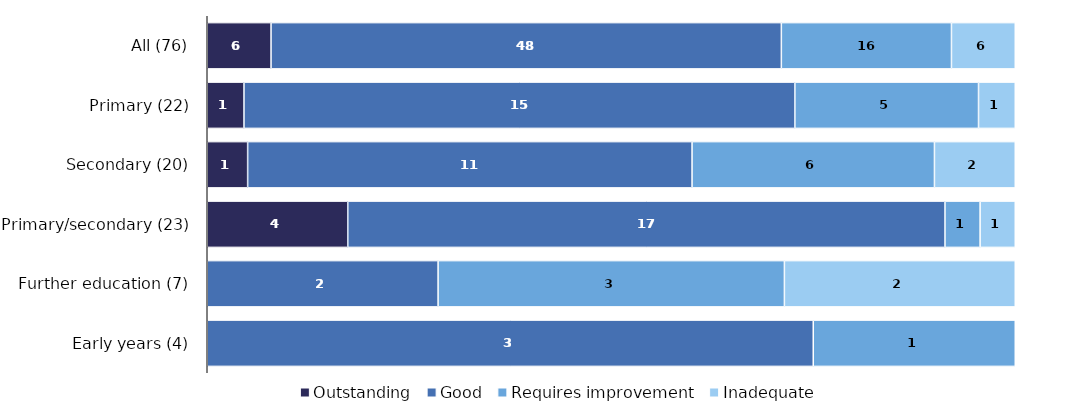
| Category | Outstanding | Good | Requires improvement | Inadequate |
|---|---|---|---|---|
| All (76) | 6 | 48 | 16 | 6 |
| Primary (22) | 1 | 15 | 5 | 1 |
| Secondary (20) | 1 | 11 | 6 | 2 |
| Primary/secondary (23) | 4 | 17 | 1 | 1 |
| Further education (7) | 0 | 2 | 3 | 2 |
| Early years (4) | 0 | 3 | 1 | 0 |